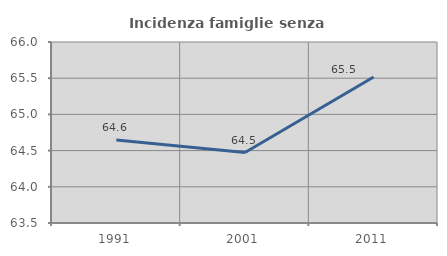
| Category | Incidenza famiglie senza nuclei |
|---|---|
| 1991.0 | 64.646 |
| 2001.0 | 64.474 |
| 2011.0 | 65.517 |